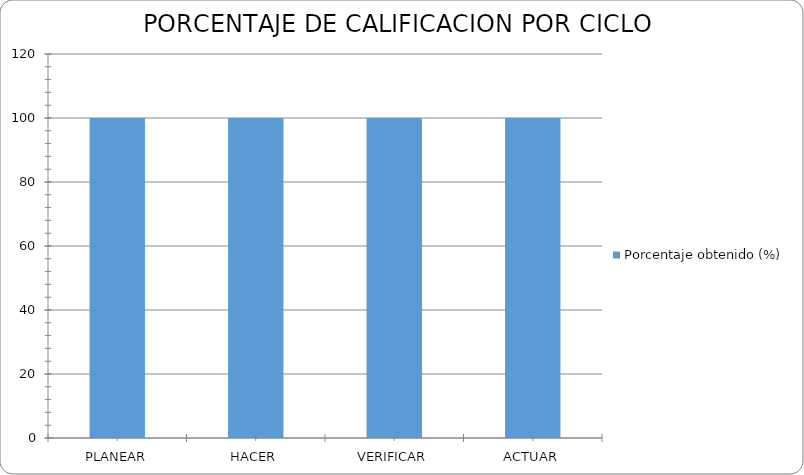
| Category | Porcentaje obtenido (%) |
|---|---|
| PLANEAR | 100 |
| HACER | 100 |
| VERIFICAR | 100 |
| ACTUAR | 100 |